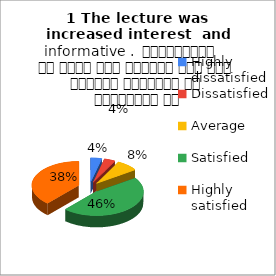
| Category | 1 The lecture was  increased interest  and informative .  व्याख्यान से रुचि में वृद्धि हुई एवं शिक्षण जानकारी से परिपूर्ण था |
|---|---|
| Highly dissatisfied | 1 |
| Dissatisfied | 1 |
| Average | 2 |
| Satisfied | 12 |
| Highly satisfied | 10 |